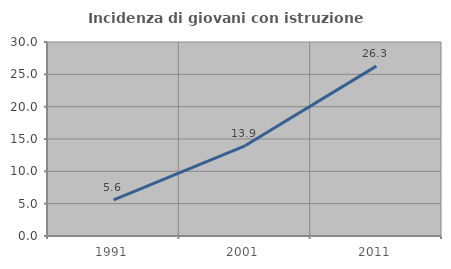
| Category | Incidenza di giovani con istruzione universitaria |
|---|---|
| 1991.0 | 5.588 |
| 2001.0 | 13.947 |
| 2011.0 | 26.269 |